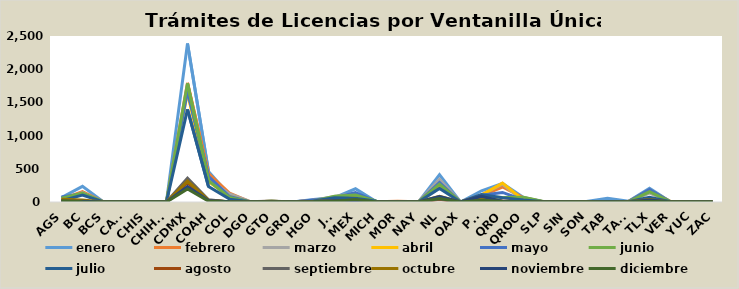
| Category | enero | febrero | marzo | abril | mayo | junio | julio | agosto | septiembre | octubre | noviembre | diciembre |
|---|---|---|---|---|---|---|---|---|---|---|---|---|
| AGS | 68 | 42 | 33 | 19 | 77 | 56 | 21 | 10 | 27 | 40 | 10 | 18 |
| BC | 236 | 156 | 143 | 121 | 122 | 134 | 103 | 6 | 11 | 32 | 12 | 3 |
| BCS | 1 | 1 | 0 | 3 | 1 | 0 | 0 | 0 | 1 | 0 | 0 | 0 |
| CAMP | 1 | 0 | 0 | 0 | 0 | 0 | 0 | 0 | 0 | 0 | 0 | 0 |
| CHIS | 1 | 1 | 0 | 2 | 3 | 0 | 1 | 0 | 0 | 0 | 1 | 0 |
| CHIHU | 9 | 2 | 2 | 6 | 5 | 9 | 5 | 0 | 1 | 0 | 1 | 0 |
| CDMX | 2386 | 1794 | 1750 | 1644 | 1670 | 1786 | 1396 | 290 | 360 | 315 | 233 | 195 |
| COAH | 459 | 428 | 344 | 307 | 386 | 321 | 233 | 27 | 35 | 28 | 23 | 13 |
| COL | 100 | 134 | 121 | 84 | 83 | 68 | 43 | 0 | 0 | 4 | 3 | 0 |
| DGO | 1 | 2 | 4 | 1 | 1 | 0 | 5 | 0 | 0 | 0 | 1 | 0 |
| GTO | 6 | 11 | 14 | 13 | 10 | 11 | 4 | 1 | 0 | 2 | 0 | 0 |
| GRO | 0 | 1 | 0 | 1 | 1 | 0 | 1 | 0 | 0 | 0 | 0 | 0 |
| HGO | 38 | 28 | 27 | 19 | 31 | 12 | 16 | 3 | 7 | 7 | 5 | 2 |
| JAL | 66 | 50 | 82 | 66 | 61 | 86 | 65 | 2 | 16 | 17 | 17 | 13 |
| MEX | 199 | 118 | 132 | 92 | 141 | 106 | 58 | 15 | 14 | 28 | 19 | 36 |
| MICH | 4 | 3 | 2 | 1 | 5 | 13 | 10 | 0 | 0 | 1 | 0 | 1 |
| MOR | 3 | 12 | 6 | 7 | 6 | 5 | 5 | 0 | 1 | 1 | 1 | 0 |
| NAY | 1 | 2 | 2 | 0 | 0 | 0 | 0 | 0 | 0 | 0 | 0 | 0 |
| NL | 412 | 304 | 345 | 256 | 294 | 269 | 205 | 37 | 49 | 87 | 81 | 52 |
| OAX | 0 | 0 | 0 | 1 | 0 | 0 | 0 | 0 | 0 | 0 | 0 | 0 |
| PUE | 169 | 98 | 112 | 103 | 103 | 88 | 112 | 52 | 54 | 76 | 85 | 25 |
| QRO | 281 | 226 | 267 | 284 | 144 | 67 | 65 | 14 | 12 | 4 | 9 | 6 |
| QROO | 68 | 64 | 21 | 29 | 31 | 73 | 29 | 0 | 1 | 5 | 4 | 2 |
| SLP | 2 | 1 | 3 | 0 | 3 | 4 | 2 | 1 | 0 | 0 | 0 | 1 |
| SIN | 2 | 2 | 1 | 2 | 0 | 0 | 0 | 0 | 0 | 0 | 0 | 1 |
| SON | 8 | 5 | 5 | 4 | 3 | 2 | 2 | 0 | 2 | 2 | 1 | 0 |
| TAB | 57 | 7 | 9 | 0 | 1 | 0 | 0 | 0 | 1 | 2 | 2 | 0 |
| TAMS | 11 | 8 | 6 | 5 | 5 | 3 | 3 | 0 | 3 | 4 | 0 | 0 |
| TLX | 208 | 163 | 133 | 181 | 188 | 154 | 71 | 7 | 20 | 37 | 29 | 12 |
| VER | 2 | 6 | 4 | 5 | 3 | 1 | 3 | 0 | 0 | 2 | 0 | 0 |
| YUC | 1 | 4 | 1 | 0 | 0 | 1 | 1 | 0 | 0 | 0 | 0 | 1 |
| ZAC | 4 | 5 | 6 | 3 | 4 | 2 | 1 | 0 | 0 | 0 | 0 | 1 |